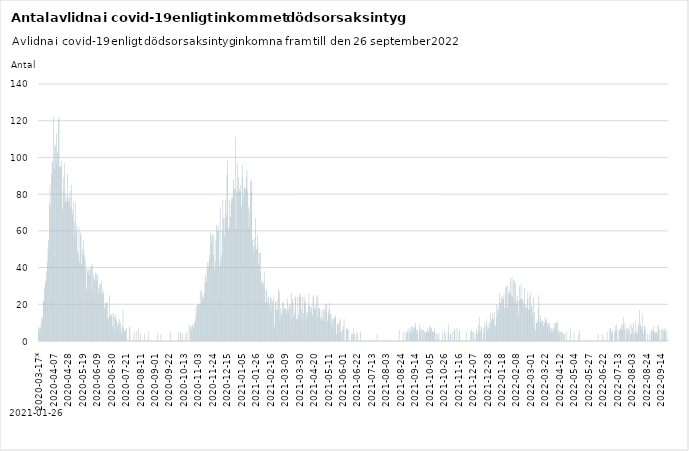
| Category | Avlidna covid-19 |
|---|---|
| 2020-03-17* | 8 |
| 2020-03-18 | 5 |
| 2020-03-19 | 7 |
| 2020-03-20 | 7 |
| 2020-03-21 | 9 |
| 2020-03-22 | 13 |
| 2020-03-23 | 12 |
| 2020-03-24 | 22 |
| 2020-03-25 | 22 |
| 2020-03-26 | 29 |
| 2020-03-27 | 32 |
| 2020-03-28 | 33 |
| 2020-03-29 | 38 |
| 2020-03-30 | 43 |
| 2020-03-31 | 50 |
| 2020-04-01 | 55 |
| 2020-04-02 | 75 |
| 2020-04-03 | 85 |
| 2020-04-04 | 73 |
| 2020-04-05 | 91 |
| 2020-04-06 | 98 |
| 2020-04-07 | 97 |
| 2020-04-08 | 122 |
| 2020-04-09 | 94 |
| 2020-04-10 | 107 |
| 2020-04-11 | 106 |
| 2020-04-12 | 113 |
| 2020-04-13 | 97 |
| 2020-04-14 | 103 |
| 2020-04-15 | 121 |
| 2020-04-16 | 122 |
| 2020-04-17 | 95 |
| 2020-04-18 | 95 |
| 2020-04-19 | 95 |
| 2020-04-20 | 98 |
| 2020-04-21 | 72 |
| 2020-04-22 | 82 |
| 2020-04-23 | 89 |
| 2020-04-24 | 97 |
| 2020-04-25 | 76 |
| 2020-04-26 | 80 |
| 2020-04-27 | 76 |
| 2020-04-28 | 91 |
| 2020-04-29 | 79 |
| 2020-04-30 | 76 |
| 2020-05-01 | 78 |
| 2020-05-02 | 82 |
| 2020-05-03 | 73 |
| 2020-05-04 | 85 |
| 2020-05-05 | 72 |
| 2020-05-06 | 69 |
| 2020-05-07 | 76 |
| 2020-05-08 | 57 |
| 2020-05-09 | 65 |
| 2020-05-10 | 75 |
| 2020-05-11 | 59 |
| 2020-05-12 | 63 |
| 2020-05-13 | 49 |
| 2020-05-14 | 47 |
| 2020-05-15 | 62 |
| 2020-05-16 | 43 |
| 2020-05-17 | 59 |
| 2020-05-18 | 57 |
| 2020-05-19 | 42 |
| 2020-05-20 | 50 |
| 2020-05-21 | 47 |
| 2020-05-22 | 55 |
| 2020-05-23 | 47 |
| 2020-05-24 | 44 |
| 2020-05-25 | 40 |
| 2020-05-26 | 28 |
| 2020-05-27 | 39 |
| 2020-05-28 | 37 |
| 2020-05-29 | 39 |
| 2020-05-30 | 36 |
| 2020-05-31 | 39 |
| 2020-06-01 | 40 |
| 2020-06-02 | 41 |
| 2020-06-03 | 28 |
| 2020-06-04 | 42 |
| 2020-06-05 | 36 |
| 2020-06-06 | 34 |
| 2020-06-07 | 33 |
| 2020-06-08 | 37 |
| 2020-06-09 | 33 |
| 2020-06-10 | 37 |
| 2020-06-11 | 36 |
| 2020-06-12 | 26 |
| 2020-06-13 | 29 |
| 2020-06-14 | 31 |
| 2020-06-15 | 31 |
| 2020-06-16 | 27 |
| 2020-06-17 | 33 |
| 2020-06-18 | 26 |
| 2020-06-19 | 28 |
| 2020-06-20 | 26 |
| 2020-06-21 | 18 |
| 2020-06-22 | 21 |
| 2020-06-23 | 20 |
| 2020-06-24 | 21 |
| 2020-06-25 | 21 |
| 2020-06-26 | 12 |
| 2020-06-27 | 13 |
| 2020-06-28 | 25 |
| 2020-06-29 | 13 |
| 2020-06-30 | 14 |
| 2020-07-01 | 14 |
| 2020-07-02 | 15 |
| 2020-07-03 | 8 |
| 2020-07-04 | 15 |
| 2020-07-05 | 6 |
| 2020-07-06 | 13 |
| 2020-07-07 | 14 |
| 2020-07-08 | 11 |
| 2020-07-09 | 12 |
| 2020-07-10 | 8 |
| 2020-07-11 | 10 |
| 2020-07-12 | 9 |
| 2020-07-13 | 12 |
| 2020-07-14 | 10 |
| 2020-07-15 | 7 |
| 2020-07-16 | 4 |
| 2020-07-17 | 8 |
| 2020-07-18 | 17 |
| 2020-07-19 | 7 |
| 2020-07-20 | 5 |
| 2020-07-21 | 6 |
| 2020-07-22 | 6 |
| 2020-07-23 | 7 |
| 2020-07-24 | 0 |
| 2020-07-25 | 0 |
| 2020-07-26 | 0 |
| 2020-07-27 | 8 |
| 2020-07-28 | 7 |
| 2020-07-29 | 0 |
| 2020-07-30 | 0 |
| 2020-07-31 | 0 |
| 2020-08-01 | 0 |
| 2020-08-02 | 0 |
| 2020-08-03 | 5 |
| 2020-08-04 | 0 |
| 2020-08-05 | 0 |
| 2020-08-06 | 5 |
| 2020-08-07 | 0 |
| 2020-08-08 | 0 |
| 2020-08-09 | 7 |
| 2020-08-10 | 0 |
| 2020-08-11 | 0 |
| 2020-08-12 | 4 |
| 2020-08-13 | 0 |
| 2020-08-14 | 0 |
| 2020-08-15 | 0 |
| 2020-08-16 | 0 |
| 2020-08-17 | 0 |
| 2020-08-18 | 4 |
| 2020-08-19 | 0 |
| 2020-08-20 | 0 |
| 2020-08-21 | 0 |
| 2020-08-22 | 0 |
| 2020-08-23 | 0 |
| 2020-08-24 | 5 |
| 2020-08-25 | 0 |
| 2020-08-26 | 0 |
| 2020-08-27 | 0 |
| 2020-08-28 | 0 |
| 2020-08-29 | 0 |
| 2020-08-30 | 0 |
| 2020-08-31 | 0 |
| 2020-09-01 | 0 |
| 2020-09-02 | 0 |
| 2020-09-03 | 0 |
| 2020-09-04 | 0 |
| 2020-09-05 | 0 |
| 2020-09-06 | 4 |
| 2020-09-07 | 0 |
| 2020-09-08 | 0 |
| 2020-09-09 | 0 |
| 2020-09-10 | 0 |
| 2020-09-11 | 4 |
| 2020-09-12 | 0 |
| 2020-09-13 | 0 |
| 2020-09-14 | 0 |
| 2020-09-15 | 0 |
| 2020-09-16 | 0 |
| 2020-09-17 | 0 |
| 2020-09-18 | 0 |
| 2020-09-19 | 0 |
| 2020-09-20 | 0 |
| 2020-09-21 | 0 |
| 2020-09-22 | 0 |
| 2020-09-23 | 0 |
| 2020-09-24 | 0 |
| 2020-09-25 | 5 |
| 2020-09-26 | 0 |
| 2020-09-27 | 0 |
| 2020-09-28 | 0 |
| 2020-09-29 | 0 |
| 2020-09-30 | 0 |
| 2020-10-01 | 0 |
| 2020-10-02 | 0 |
| 2020-10-03 | 0 |
| 2020-10-04 | 0 |
| 2020-10-05 | 0 |
| 2020-10-06 | 5 |
| 2020-10-07 | 0 |
| 2020-10-08 | 0 |
| 2020-10-09 | 5 |
| 2020-10-10 | 4 |
| 2020-10-11 | 0 |
| 2020-10-12 | 4 |
| 2020-10-13 | 0 |
| 2020-10-14 | 0 |
| 2020-10-15 | 0 |
| 2020-10-16 | 0 |
| 2020-10-17 | 4 |
| 2020-10-18 | 0 |
| 2020-10-19 | 5 |
| 2020-10-20 | 0 |
| 2020-10-21 | 0 |
| 2020-10-22 | 9 |
| 2020-10-23 | 0 |
| 2020-10-24 | 8 |
| 2020-10-25 | 6 |
| 2020-10-26 | 8 |
| 2020-10-27 | 9 |
| 2020-10-28 | 7 |
| 2020-10-29 | 9 |
| 2020-10-30 | 10 |
| 2020-10-31 | 11 |
| 2020-11-01 | 19 |
| 2020-11-02 | 15 |
| 2020-11-03 | 20 |
| 2020-11-04 | 19 |
| 2020-11-05 | 20 |
| 2020-11-06 | 20 |
| 2020-11-07 | 27 |
| 2020-11-08 | 20 |
| 2020-11-09 | 28 |
| 2020-11-10 | 25 |
| 2020-11-11 | 24 |
| 2020-11-12 | 23 |
| 2020-11-13 | 26 |
| 2020-11-14 | 32 |
| 2020-11-15 | 36 |
| 2020-11-16 | 32 |
| 2020-11-17 | 39 |
| 2020-11-18 | 43 |
| 2020-11-19 | 41 |
| 2020-11-20 | 44 |
| 2020-11-21 | 47 |
| 2020-11-22 | 59 |
| 2020-11-23 | 53 |
| 2020-11-24 | 57 |
| 2020-11-25 | 58 |
| 2020-11-26 | 47 |
| 2020-11-27 | 58 |
| 2020-11-28 | 39 |
| 2020-11-29 | 43 |
| 2020-11-30 | 55 |
| 2020-12-01 | 63 |
| 2020-12-02 | 60 |
| 2020-12-03 | 63 |
| 2020-12-04 | 60 |
| 2020-12-05 | 40 |
| 2020-12-06 | 73 |
| 2020-12-07 | 43 |
| 2020-12-08 | 47 |
| 2020-12-09 | 60 |
| 2020-12-10 | 77 |
| 2020-12-11 | 67 |
| 2020-12-12 | 57 |
| 2020-12-13 | 67 |
| 2020-12-14 | 77 |
| 2020-12-15 | 69 |
| 2020-12-16 | 91 |
| 2020-12-17 | 99 |
| 2020-12-18 | 61 |
| 2020-12-19 | 62 |
| 2020-12-20 | 77 |
| 2020-12-21 | 68 |
| 2020-12-22 | 76 |
| 2020-12-23 | 78 |
| 2020-12-24 | 78 |
| 2020-12-25 | 88 |
| 2020-12-26 | 83 |
| 2020-12-27 | 83 |
| 2020-12-28 | 111 |
| 2020-12-29 | 61 |
| 2020-12-30 | 82 |
| 2020-12-31 | 97 |
| 2021-01-01 | 81 |
| 2021-01-02 | 89 |
| 2021-01-03 | 83 |
| 2021-01-04 | 81 |
| 2021-01-05 | 85 |
| 2021-01-06 | 74 |
| 2021-01-07 | 96 |
| 2021-01-08 | 89 |
| 2021-01-09 | 79 |
| 2021-01-10 | 83 |
| 2021-01-11 | 84 |
| 2021-01-12 | 83 |
| 2021-01-13 | 89 |
| 2021-01-14 | 93 |
| 2021-01-15 | 82 |
| 2021-01-16 | 73 |
| 2021-01-17 | 62 |
| 2021-01-18 | 71 |
| 2021-01-19 | 87 |
| 2021-01-20 | 81 |
| 2021-01-21 | 88 |
| 2021-01-22 | 55 |
| 2021-01-23 | 52 |
| 2021-01-24 | 48 |
| 2021-01-25 | 56 |
| 2021-01-26 | 67 |
| 2021-01-27 | 52 |
| 2021-01-28 | 50 |
| 2021-01-29 | 58 |
| 2021-01-30 | 51 |
| 2021-01-31 | 42 |
| 2021-02-01 | 48 |
| 2021-02-02 | 38 |
| 2021-02-03 | 48 |
| 2021-02-04 | 32 |
| 2021-02-05 | 31 |
| 2021-02-06 | 33 |
| 2021-02-07 | 31 |
| 2021-02-08 | 38 |
| 2021-02-09 | 29 |
| 2021-02-10 | 21 |
| 2021-02-11 | 28 |
| 2021-02-12 | 27 |
| 2021-02-13 | 21 |
| 2021-02-14 | 24 |
| 2021-02-15 | 23 |
| 2021-02-16 | 19 |
| 2021-02-17 | 24 |
| 2021-02-18 | 16 |
| 2021-02-19 | 23 |
| 2021-02-20 | 22 |
| 2021-02-21 | 19 |
| 2021-02-22 | 24 |
| 2021-02-23 | 8 |
| 2021-02-24 | 22 |
| 2021-02-25 | 21 |
| 2021-02-26 | 17 |
| 2021-02-27 | 17 |
| 2021-02-28 | 23 |
| 2021-03-01 | 29 |
| 2021-03-02 | 27 |
| 2021-03-03 | 12 |
| 2021-03-04 | 18 |
| 2021-03-05 | 15 |
| 2021-03-06 | 14 |
| 2021-03-07 | 21 |
| 2021-03-08 | 21 |
| 2021-03-09 | 18 |
| 2021-03-10 | 17 |
| 2021-03-11 | 18 |
| 2021-03-12 | 15 |
| 2021-03-13 | 17 |
| 2021-03-14 | 23 |
| 2021-03-15 | 18 |
| 2021-03-16 | 15 |
| 2021-03-17 | 20 |
| 2021-03-18 | 19 |
| 2021-03-19 | 11 |
| 2021-03-20 | 26 |
| 2021-03-21 | 23 |
| 2021-03-22 | 21 |
| 2021-03-23 | 13 |
| 2021-03-24 | 15 |
| 2021-03-25 | 24 |
| 2021-03-26 | 24 |
| 2021-03-27 | 12 |
| 2021-03-28 | 12 |
| 2021-03-29 | 24 |
| 2021-03-30 | 14 |
| 2021-03-31 | 26 |
| 2021-04-01 | 24 |
| 2021-04-02 | 25 |
| 2021-04-03 | 17 |
| 2021-04-04 | 11 |
| 2021-04-05 | 24 |
| 2021-04-06 | 15 |
| 2021-04-07 | 24 |
| 2021-04-08 | 20 |
| 2021-04-09 | 22 |
| 2021-04-10 | 12 |
| 2021-04-11 | 16 |
| 2021-04-12 | 15 |
| 2021-04-13 | 19 |
| 2021-04-14 | 26 |
| 2021-04-15 | 19 |
| 2021-04-16 | 16 |
| 2021-04-17 | 19 |
| 2021-04-18 | 18 |
| 2021-04-19 | 14 |
| 2021-04-20 | 25 |
| 2021-04-21 | 24 |
| 2021-04-22 | 18 |
| 2021-04-23 | 17 |
| 2021-04-24 | 19 |
| 2021-04-25 | 24 |
| 2021-04-26 | 13 |
| 2021-04-27 | 25 |
| 2021-04-28 | 18 |
| 2021-04-29 | 18 |
| 2021-04-30 | 16 |
| 2021-05-01 | 12 |
| 2021-05-02 | 13 |
| 2021-05-03 | 17 |
| 2021-05-04 | 11 |
| 2021-05-05 | 17 |
| 2021-05-06 | 11 |
| 2021-05-07 | 17 |
| 2021-05-08 | 20 |
| 2021-05-09 | 16 |
| 2021-05-10 | 20 |
| 2021-05-11 | 11 |
| 2021-05-12 | 15 |
| 2021-05-13 | 17 |
| 2021-05-14 | 21 |
| 2021-05-15 | 14 |
| 2021-05-16 | 15 |
| 2021-05-17 | 9 |
| 2021-05-18 | 12 |
| 2021-05-19 | 7 |
| 2021-05-20 | 12 |
| 2021-05-21 | 13 |
| 2021-05-22 | 13 |
| 2021-05-23 | 14 |
| 2021-05-24 | 4 |
| 2021-05-25 | 9 |
| 2021-05-26 | 10 |
| 2021-05-27 | 9 |
| 2021-05-28 | 12 |
| 2021-05-29 | 4 |
| 2021-05-30 | 11 |
| 2021-05-31 | 5 |
| 2021-06-01 | 0 |
| 2021-06-02 | 6 |
| 2021-06-03 | 8 |
| 2021-06-04 | 12 |
| 2021-06-05 | 0 |
| 2021-06-06 | 0 |
| 2021-06-07 | 6 |
| 2021-06-08 | 7 |
| 2021-06-09 | 7 |
| 2021-06-10 | 6 |
| 2021-06-11 | 0 |
| 2021-06-12 | 0 |
| 2021-06-13 | 0 |
| 2021-06-14 | 0 |
| 2021-06-15 | 4 |
| 2021-06-16 | 4 |
| 2021-06-17 | 0 |
| 2021-06-18 | 7 |
| 2021-06-19 | 4 |
| 2021-06-20 | 0 |
| 2021-06-21 | 0 |
| 2021-06-22 | 5 |
| 2021-06-23 | 0 |
| 2021-06-24 | 4 |
| 2021-06-25 | 0 |
| 2021-06-26 | 0 |
| 2021-06-27 | 0 |
| 2021-06-28 | 5 |
| 2021-06-29 | 0 |
| 2021-06-30 | 0 |
| 2021-07-01 | 0 |
| 2021-07-02 | 0 |
| 2021-07-03 | 0 |
| 2021-07-04 | 0 |
| 2021-07-05 | 0 |
| 2021-07-06 | 0 |
| 2021-07-07 | 0 |
| 2021-07-08 | 0 |
| 2021-07-09 | 0 |
| 2021-07-10 | 0 |
| 2021-07-11 | 0 |
| 2021-07-12 | 0 |
| 2021-07-13 | 0 |
| 2021-07-14 | 0 |
| 2021-07-15 | 0 |
| 2021-07-16 | 0 |
| 2021-07-17 | 0 |
| 2021-07-18 | 0 |
| 2021-07-19 | 0 |
| 2021-07-20 | 0 |
| 2021-07-21 | 0 |
| 2021-07-22 | 4 |
| 2021-07-23 | 0 |
| 2021-07-24 | 0 |
| 2021-07-25 | 0 |
| 2021-07-26 | 0 |
| 2021-07-27 | 0 |
| 2021-07-28 | 0 |
| 2021-07-29 | 0 |
| 2021-07-30 | 0 |
| 2021-07-31 | 0 |
| 2021-08-01 | 0 |
| 2021-08-02 | 0 |
| 2021-08-03 | 0 |
| 2021-08-04 | 0 |
| 2021-08-05 | 0 |
| 2021-08-06 | 0 |
| 2021-08-07 | 0 |
| 2021-08-08 | 0 |
| 2021-08-09 | 0 |
| 2021-08-10 | 0 |
| 2021-08-11 | 0 |
| 2021-08-12 | 0 |
| 2021-08-13 | 0 |
| 2021-08-14 | 0 |
| 2021-08-15 | 0 |
| 2021-08-16 | 0 |
| 2021-08-17 | 0 |
| 2021-08-18 | 0 |
| 2021-08-19 | 0 |
| 2021-08-20 | 0 |
| 2021-08-21 | 0 |
| 2021-08-22 | 0 |
| 2021-08-23 | 6 |
| 2021-08-24 | 0 |
| 2021-08-25 | 0 |
| 2021-08-26 | 0 |
| 2021-08-27 | 0 |
| 2021-08-28 | 0 |
| 2021-08-29 | 5 |
| 2021-08-30 | 0 |
| 2021-08-31 | 0 |
| 2021-09-01 | 0 |
| 2021-09-02 | 5 |
| 2021-09-03 | 4 |
| 2021-09-04 | 5 |
| 2021-09-05 | 7 |
| 2021-09-06 | 0 |
| 2021-09-07 | 5 |
| 2021-09-08 | 7 |
| 2021-09-09 | 5 |
| 2021-09-10 | 8 |
| 2021-09-11 | 4 |
| 2021-09-12 | 8 |
| 2021-09-13 | 7 |
| 2021-09-14 | 7 |
| 2021-09-15 | 8 |
| 2021-09-16 | 10 |
| 2021-09-17 | 6 |
| 2021-09-18 | 4 |
| 2021-09-19 | 6 |
| 2021-09-20 | 0 |
| 2021-09-21 | 5 |
| 2021-09-22 | 9 |
| 2021-09-23 | 6 |
| 2021-09-24 | 7 |
| 2021-09-25 | 0 |
| 2021-09-26 | 6 |
| 2021-09-27 | 6 |
| 2021-09-28 | 0 |
| 2021-09-29 | 5 |
| 2021-09-30 | 4 |
| 2021-10-01 | 5 |
| 2021-10-02 | 5 |
| 2021-10-03 | 7 |
| 2021-10-04 | 5 |
| 2021-10-05 | 5 |
| 2021-10-06 | 8 |
| 2021-10-07 | 7 |
| 2021-10-08 | 8 |
| 2021-10-09 | 7 |
| 2021-10-10 | 5 |
| 2021-10-11 | 5 |
| 2021-10-12 | 5 |
| 2021-10-13 | 7 |
| 2021-10-14 | 5 |
| 2021-10-15 | 0 |
| 2021-10-16 | 4 |
| 2021-10-17 | 0 |
| 2021-10-18 | 4 |
| 2021-10-19 | 0 |
| 2021-10-20 | 4 |
| 2021-10-21 | 0 |
| 2021-10-22 | 0 |
| 2021-10-23 | 0 |
| 2021-10-24 | 0 |
| 2021-10-25 | 5 |
| 2021-10-26 | 0 |
| 2021-10-27 | 0 |
| 2021-10-28 | 6 |
| 2021-10-29 | 4 |
| 2021-10-30 | 0 |
| 2021-10-31 | 0 |
| 2021-11-01 | 0 |
| 2021-11-02 | 5 |
| 2021-11-03 | 9 |
| 2021-11-04 | 0 |
| 2021-11-05 | 4 |
| 2021-11-06 | 4 |
| 2021-11-07 | 0 |
| 2021-11-08 | 0 |
| 2021-11-09 | 5 |
| 2021-11-10 | 0 |
| 2021-11-11 | 7 |
| 2021-11-12 | 6 |
| 2021-11-13 | 0 |
| 2021-11-14 | 0 |
| 2021-11-15 | 7 |
| 2021-11-16 | 0 |
| 2021-11-17 | 0 |
| 2021-11-18 | 5 |
| 2021-11-19 | 6 |
| 2021-11-20 | 0 |
| 2021-11-21 | 0 |
| 2021-11-22 | 0 |
| 2021-11-23 | 0 |
| 2021-11-24 | 0 |
| 2021-11-25 | 0 |
| 2021-11-26 | 0 |
| 2021-11-27 | 0 |
| 2021-11-28 | 0 |
| 2021-11-29 | 5 |
| 2021-11-30 | 0 |
| 2021-12-01 | 0 |
| 2021-12-02 | 0 |
| 2021-12-03 | 0 |
| 2021-12-04 | 0 |
| 2021-12-05 | 5 |
| 2021-12-06 | 6 |
| 2021-12-07 | 5 |
| 2021-12-08 | 0 |
| 2021-12-09 | 5 |
| 2021-12-10 | 0 |
| 2021-12-11 | 4 |
| 2021-12-12 | 0 |
| 2021-12-13 | 6 |
| 2021-12-14 | 6 |
| 2021-12-15 | 4 |
| 2021-12-16 | 9 |
| 2021-12-17 | 5 |
| 2021-12-18 | 13 |
| 2021-12-19 | 5 |
| 2021-12-20 | 8 |
| 2021-12-21 | 7 |
| 2021-12-22 | 0 |
| 2021-12-23 | 4 |
| 2021-12-24 | 7 |
| 2021-12-25 | 10 |
| 2021-12-26 | 0 |
| 2021-12-27 | 8 |
| 2021-12-28 | 12 |
| 2021-12-29 | 6 |
| 2021-12-30 | 9 |
| 2021-12-31 | 7 |
| 2022-01-01 | 10 |
| 2022-01-02 | 7 |
| 2022-01-03 | 15 |
| 2022-01-04 | 11 |
| 2022-01-05 | 12 |
| 2022-01-06 | 15 |
| 2022-01-07 | 12 |
| 2022-01-08 | 16 |
| 2022-01-09 | 9 |
| 2022-01-10 | 8 |
| 2022-01-11 | 20 |
| 2022-01-12 | 13 |
| 2022-01-13 | 17 |
| 2022-01-14 | 19 |
| 2022-01-15 | 16 |
| 2022-01-16 | 26 |
| 2022-01-17 | 21 |
| 2022-01-18 | 20 |
| 2022-01-19 | 24 |
| 2022-01-20 | 23 |
| 2022-01-21 | 25 |
| 2022-01-22 | 23 |
| 2022-01-23 | 18 |
| 2022-01-24 | 26 |
| 2022-01-25 | 29 |
| 2022-01-26 | 30 |
| 2022-01-27 | 18 |
| 2022-01-28 | 30 |
| 2022-01-29 | 26 |
| 2022-01-30 | 27 |
| 2022-01-31 | 25 |
| 2022-02-01 | 34 |
| 2022-02-02 | 25 |
| 2022-02-03 | 35 |
| 2022-02-04 | 24 |
| 2022-02-05 | 33 |
| 2022-02-06 | 21 |
| 2022-02-07 | 33 |
| 2022-02-08 | 31 |
| 2022-02-09 | 22 |
| 2022-02-10 | 20 |
| 2022-02-11 | 25 |
| 2022-02-12 | 14 |
| 2022-02-13 | 22 |
| 2022-02-14 | 30 |
| 2022-02-15 | 23 |
| 2022-02-16 | 31 |
| 2022-02-17 | 23 |
| 2022-02-18 | 23 |
| 2022-02-19 | 22 |
| 2022-02-20 | 19 |
| 2022-02-21 | 29 |
| 2022-02-22 | 20 |
| 2022-02-23 | 18 |
| 2022-02-24 | 18 |
| 2022-02-25 | 23 |
| 2022-02-26 | 27 |
| 2022-02-27 | 17 |
| 2022-02-28 | 24 |
| 2022-03-01 | 17 |
| 2022-03-02 | 26 |
| 2022-03-03 | 19 |
| 2022-03-04 | 19 |
| 2022-03-05 | 15 |
| 2022-03-06 | 24 |
| 2022-03-07 | 8 |
| 2022-03-08 | 16 |
| 2022-03-09 | 6 |
| 2022-03-10 | 10 |
| 2022-03-11 | 10 |
| 2022-03-12 | 11 |
| 2022-03-13 | 18 |
| 2022-03-14 | 25 |
| 2022-03-15 | 10 |
| 2022-03-16 | 14 |
| 2022-03-17 | 12 |
| 2022-03-18 | 10 |
| 2022-03-19 | 11 |
| 2022-03-20 | 11 |
| 2022-03-21 | 8 |
| 2022-03-22 | 10 |
| 2022-03-23 | 13 |
| 2022-03-24 | 11 |
| 2022-03-25 | 12 |
| 2022-03-26 | 10 |
| 2022-03-27 | 8 |
| 2022-03-28 | 10 |
| 2022-03-29 | 8 |
| 2022-03-30 | 10 |
| 2022-03-31 | 5 |
| 2022-04-01 | 7 |
| 2022-04-02 | 7 |
| 2022-04-03 | 5 |
| 2022-04-04 | 7 |
| 2022-04-05 | 10 |
| 2022-04-06 | 6 |
| 2022-04-07 | 10 |
| 2022-04-08 | 8 |
| 2022-04-09 | 10 |
| 2022-04-10 | 11 |
| 2022-04-11 | 4 |
| 2022-04-12 | 6 |
| 2022-04-13 | 5 |
| 2022-04-14 | 5 |
| 2022-04-15 | 0 |
| 2022-04-16 | 5 |
| 2022-04-17 | 5 |
| 2022-04-18 | 0 |
| 2022-04-19 | 4 |
| 2022-04-20 | 4 |
| 2022-04-21 | 0 |
| 2022-04-22 | 0 |
| 2022-04-23 | 5 |
| 2022-04-24 | 0 |
| 2022-04-25 | 0 |
| 2022-04-26 | 0 |
| 2022-04-28 | 0 |
| 2022-04-29 | 0 |
| 2022-04-30 | 7 |
| 2022-05-01 | 0 |
| 2022-05-02 | 0 |
| 2022-05-03 | 0 |
| 2022-05-04 | 0 |
| 2022-05-05 | 5 |
| 2022-05-06 | 0 |
| 2022-05-07 | 0 |
| 2022-05-08 | 0 |
| 2022-05-09 | 0 |
| 2022-05-10 | 0 |
| 2022-05-11 | 4 |
| 2022-05-13 | 0 |
| 2022-05-14 | 6 |
| 2022-05-15 | 0 |
| 2022-05-16 | 0 |
| 2022-05-17 | 0 |
| 2022-05-18 | 0 |
| 2022-05-19 | 0 |
| 2022-05-20 | 0 |
| 2022-05-21 | 0 |
| 2022-05-22 | 0 |
| 2022-05-24 | 0 |
| 2022-05-25 | 0 |
| 2022-05-26 | 0 |
| 2022-05-27 | 0 |
| 2022-05-28 | 0 |
| 2022-05-29 | 0 |
| 2022-05-30 | 0 |
| 2022-05-31 | 0 |
| 2022-06-01 | 0 |
| 2022-06-02 | 0 |
| 2022-06-04 | 0 |
| 2022-06-05 | 0 |
| 2022-06-07 | 0 |
| 2022-06-09 | 0 |
| 2022-06-10 | 0 |
| 2022-06-11 | 0 |
| 2022-06-12 | 0 |
| 2022-06-13 | 0 |
| 2022-06-16 | 4 |
| 2022-06-17 | 0 |
| 2022-06-18 | 0 |
| 2022-06-19 | 0 |
| 2022-06-20 | 0 |
| 2022-06-21 | 0 |
| 2022-06-22 | 0 |
| 2022-06-23 | 4 |
| 2022-06-24 | 0 |
| 2022-06-25 | 0 |
| 2022-06-26 | 0 |
| 2022-06-27 | 0 |
| 2022-06-28 | 0 |
| 2022-06-29 | 5 |
| 2022-06-30 | 0 |
| 2022-07-01 | 0 |
| 2022-07-02 | 0 |
| 2022-07-03 | 7 |
| 2022-07-04 | 7 |
| 2022-07-05 | 4 |
| 2022-07-06 | 5 |
| 2022-07-07 | 6 |
| 2022-07-08 | 0 |
| 2022-07-09 | 0 |
| 2022-07-10 | 5 |
| 2022-07-11 | 8 |
| 2022-07-12 | 5 |
| 2022-07-13 | 9 |
| 2022-07-14 | 0 |
| 2022-07-15 | 6 |
| 2022-07-16 | 0 |
| 2022-07-17 | 6 |
| 2022-07-18 | 6 |
| 2022-07-19 | 7 |
| 2022-07-20 | 9 |
| 2022-07-21 | 6 |
| 2022-07-22 | 9 |
| 2022-07-23 | 13 |
| 2022-07-24 | 6 |
| 2022-07-25 | 10 |
| 2022-07-26 | 0 |
| 2022-07-27 | 7 |
| 2022-07-28 | 4 |
| 2022-07-29 | 7 |
| 2022-07-30 | 6 |
| 2022-07-31 | 0 |
| 2022-08-01 | 8 |
| 2022-08-02 | 4 |
| 2022-08-03 | 4 |
| 2022-08-04 | 9 |
| 2022-08-05 | 7 |
| 2022-08-06 | 10 |
| 2022-08-07 | 0 |
| 2022-08-08 | 4 |
| 2022-08-09 | 11 |
| 2022-08-10 | 5 |
| 2022-08-11 | 5 |
| 2022-08-12 | 4 |
| 2022-08-13 | 8 |
| 2022-08-14 | 9 |
| 2022-08-15 | 17 |
| 2022-08-16 | 10 |
| 2022-08-17 | 8 |
| 2022-08-18 | 8 |
| 2022-08-19 | 15 |
| 2022-08-20 | 6 |
| 2022-08-21 | 4 |
| 2022-08-22 | 8 |
| 2022-08-23 | 8 |
| 2022-08-24 | 6 |
| 2022-08-25 | 0 |
| 2022-08-26 | 0 |
| 2022-08-27 | 4 |
| 2022-08-28 | 0 |
| 2022-08-29 | 0 |
| 2022-08-30 | 4 |
| 2022-08-31 | 0 |
| 2022-09-01 | 6 |
| 2022-09-02 | 6 |
| 2022-09-03 | 5 |
| 2022-09-04 | 8 |
| 2022-09-05 | 6 |
| 2022-09-06 | 5 |
| 2022-09-07 | 4 |
| 2022-09-08 | 5 |
| 2022-09-09 | 5 |
| 2022-09-10 | 4 |
| 2022-09-11 | 9 |
| 2022-09-12 | 8 |
| 2022-09-13 | 6 |
| 2022-09-14 | 0 |
| 2022-09-15 | 0 |
| 2022-09-16 | 6 |
| 2022-09-17 | 7 |
| 2022-09-18 | 0 |
| 2022-09-20 | 6 |
| 2022-09-21 | 7 |
| 2022-09-22 | 5 |
| 2022-09-23 | 6 |
| 2022-09-24 | 0 |
| 2022-09-25 | 6 |
| 2022-09-26 | 0 |